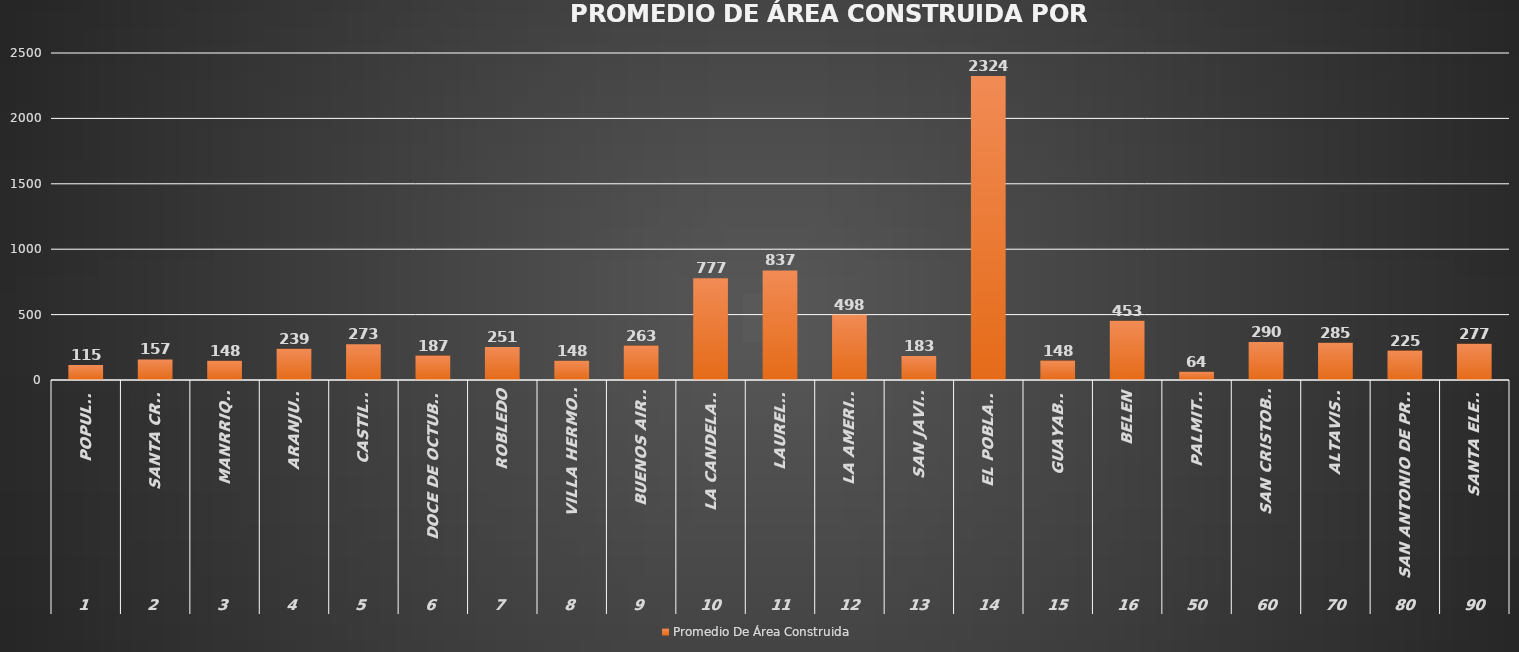
| Category | Promedio De Área Construida |
|---|---|
| 0 | 114.783 |
| 1 | 157.032 |
| 2 | 147.576 |
| 3 | 239.314 |
| 4 | 273.417 |
| 5 | 186.575 |
| 6 | 251.387 |
| 7 | 147.635 |
| 8 | 263.339 |
| 9 | 777.436 |
| 10 | 837.345 |
| 11 | 498.041 |
| 12 | 182.703 |
| 13 | 2324.159 |
| 14 | 148.377 |
| 15 | 452.503 |
| 16 | 63.735 |
| 17 | 290.3 |
| 18 | 285.078 |
| 19 | 225.249 |
| 20 | 276.706 |